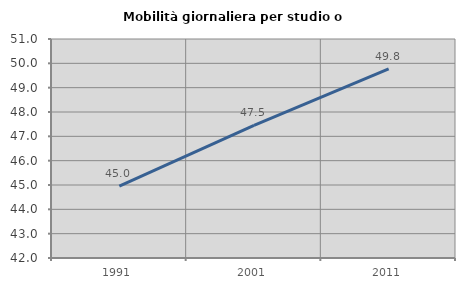
| Category | Mobilità giornaliera per studio o lavoro |
|---|---|
| 1991.0 | 44.953 |
| 2001.0 | 47.451 |
| 2011.0 | 49.775 |